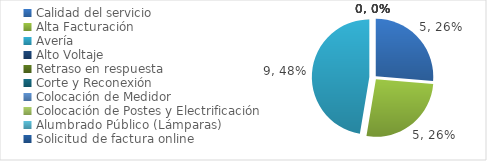
| Category | Series 0 |
|---|---|
| Calidad del servicio | 5 |
| Alta Facturación | 5 |
| Avería | 9 |
| Alto Voltaje | 0 |
| Retraso en respuesta | 0 |
| Corte y Reconexión  | 0 |
| Colocación de Medidor | 0 |
| Colocación de Postes y Electrificación  | 0 |
| Alumbrado Público (Lámparas) | 0 |
| Solicitud de factura online | 0 |